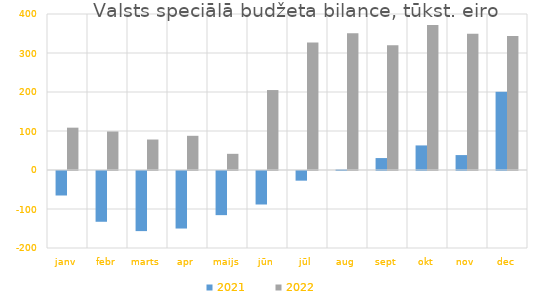
| Category | 2021 | 2022 |
|---|---|---|
| janv | -62808.075 | 108554.179 |
| febr | -130183.513 | 98735.641 |
| marts | -154114.179 | 78145.563 |
| apr | -147503.301 | 87696.664 |
| maijs | -113180.114 | 41467.941 |
| jūn | -85892.075 | 205002.224 |
| jūl | -24790.077 | 326863.351 |
| aug | 1407.353 | 350378.42 |
| sept | 30609.788 | 320128.894 |
| okt | 63006.825 | 371998.298 |
| nov | 38267.962 | 349474.929 |
| dec | 200524.486 | 343526.239 |